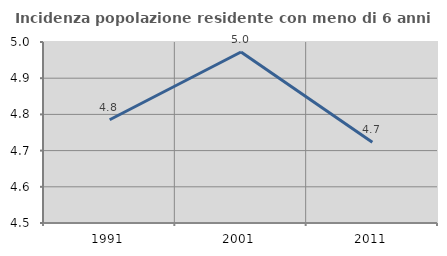
| Category | Incidenza popolazione residente con meno di 6 anni |
|---|---|
| 1991.0 | 4.785 |
| 2001.0 | 4.972 |
| 2011.0 | 4.723 |